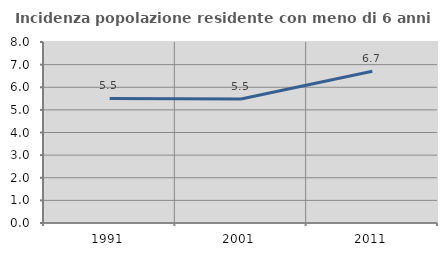
| Category | Incidenza popolazione residente con meno di 6 anni |
|---|---|
| 1991.0 | 5.505 |
| 2001.0 | 5.483 |
| 2011.0 | 6.711 |